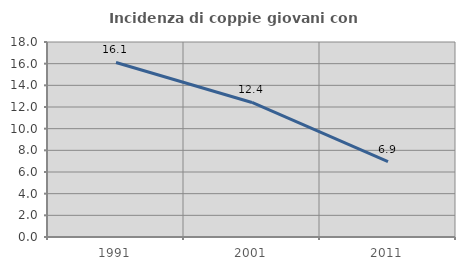
| Category | Incidenza di coppie giovani con figli |
|---|---|
| 1991.0 | 16.11 |
| 2001.0 | 12.42 |
| 2011.0 | 6.946 |